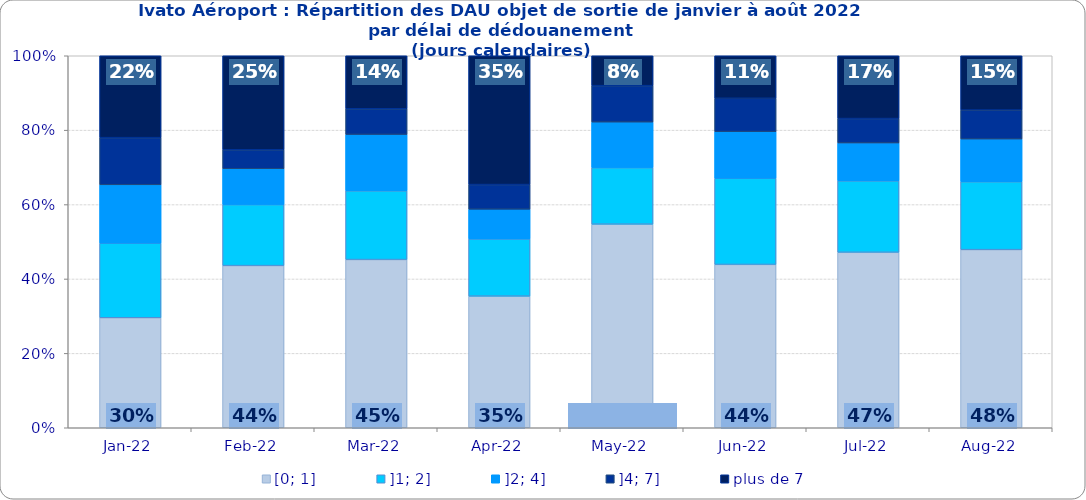
| Category | [0; 1] | ]1; 2] | ]2; 4] | ]4; 7] | plus de 7 |
|---|---|---|---|---|---|
| 2022-01-01 | 0.296 | 0.201 | 0.157 | 0.127 | 0.22 |
| 2022-02-01 | 0.436 | 0.164 | 0.096 | 0.051 | 0.253 |
| 2022-03-01 | 0.452 | 0.185 | 0.151 | 0.069 | 0.143 |
| 2022-04-01 | 0.354 | 0.154 | 0.08 | 0.066 | 0.346 |
| 2022-05-01 | 0.547 | 0.152 | 0.122 | 0.098 | 0.08 |
| 2022-06-01 | 0.439 | 0.232 | 0.125 | 0.09 | 0.114 |
| 2022-07-01 | 0.472 | 0.192 | 0.102 | 0.066 | 0.169 |
| 2022-08-01 | 0.479 | 0.183 | 0.115 | 0.078 | 0.146 |